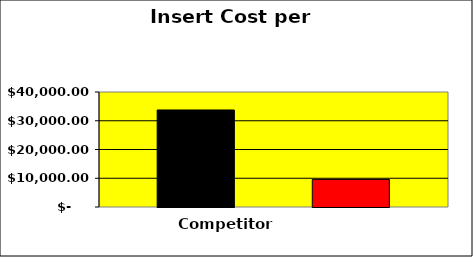
| Category | Competitor | Toshiba | Series 2 |
|---|---|---|---|
| 0 | 33750 |  | 9593.023 |